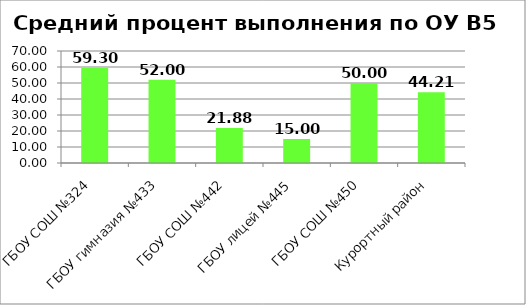
| Category | B5 |
|---|---|
| ГБОУ СОШ №324 | 59.302 |
| ГБОУ гимназия №433 | 52 |
| ГБОУ СОШ №442 | 21.875 |
| ГБОУ лицей №445 | 15 |
| ГБОУ СОШ №450 | 50 |
| Курортный район | 44.215 |